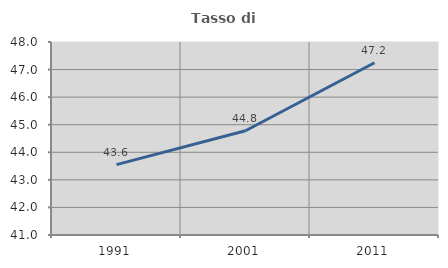
| Category | Tasso di occupazione   |
|---|---|
| 1991.0 | 43.553 |
| 2001.0 | 44.782 |
| 2011.0 | 47.249 |